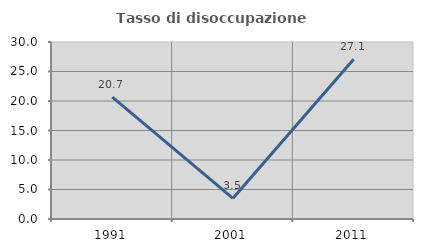
| Category | Tasso di disoccupazione giovanile  |
|---|---|
| 1991.0 | 20.667 |
| 2001.0 | 3.509 |
| 2011.0 | 27.083 |